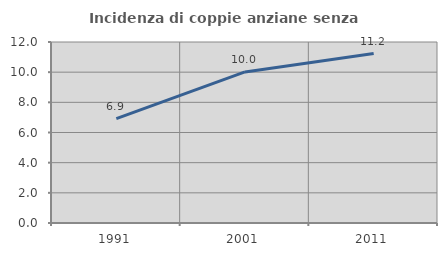
| Category | Incidenza di coppie anziane senza figli  |
|---|---|
| 1991.0 | 6.917 |
| 2001.0 | 10.016 |
| 2011.0 | 11.236 |